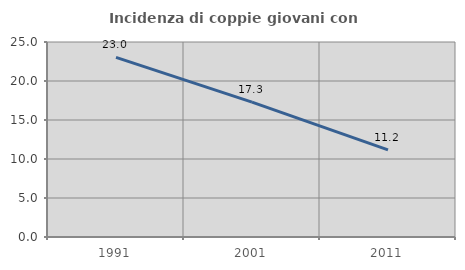
| Category | Incidenza di coppie giovani con figli |
|---|---|
| 1991.0 | 23.027 |
| 2001.0 | 17.297 |
| 2011.0 | 11.178 |